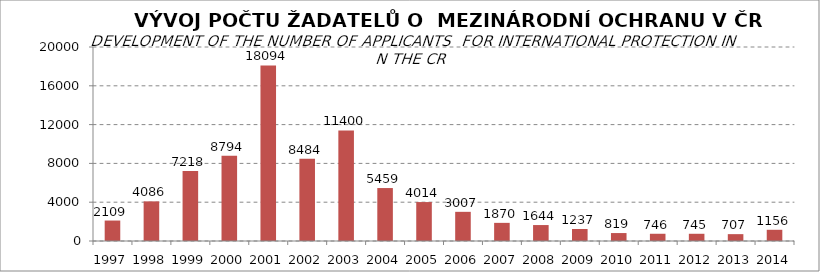
| Category | Series 1 |
|---|---|
| 1997.0 | 2109 |
| 1998.0 | 4086 |
| 1999.0 | 7218 |
| 2000.0 | 8794 |
| 2001.0 | 18094 |
| 2002.0 | 8484 |
| 2003.0 | 11400 |
| 2004.0 | 5459 |
| 2005.0 | 4014 |
| 2006.0 | 3007 |
| 2007.0 | 1870 |
| 2008.0 | 1644 |
| 2009.0 | 1237 |
| 2010.0 | 819 |
| 2011.0 | 746 |
| 2012.0 | 745 |
| 2013.0 | 707 |
| 2014.0 | 1156 |